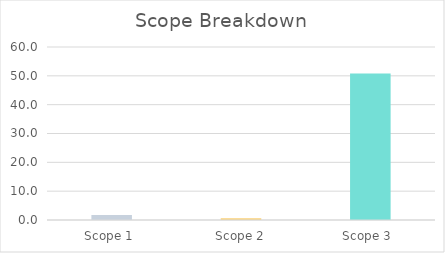
| Category | Series 0 |
|---|---|
| Scope 1  | 1.771 |
| Scope 2 | 0.568 |
| Scope 3  | 50.803 |